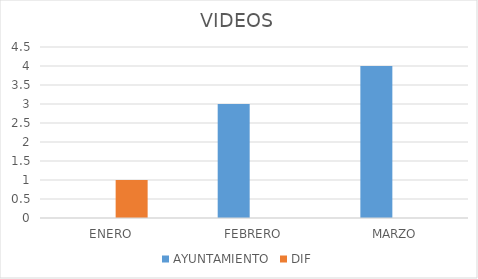
| Category | AYUNTAMIENTO | DIF |
|---|---|---|
| ENERO | 0 | 1 |
| FEBRERO | 3 | 0 |
| MARZO | 4 | 0 |